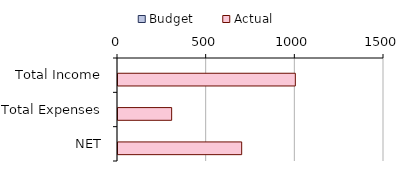
| Category | Budget | Actual |
|---|---|---|
| Total Income | 0 | 1000 |
| Total Expenses | 0 | 302.54 |
| NET | 0 | 697.46 |